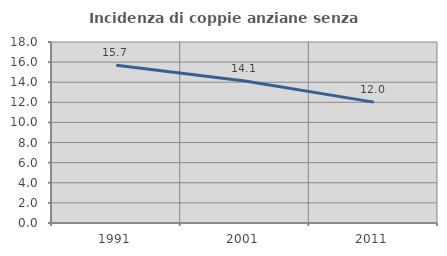
| Category | Incidenza di coppie anziane senza figli  |
|---|---|
| 1991.0 | 15.694 |
| 2001.0 | 14.118 |
| 2011.0 | 12.021 |